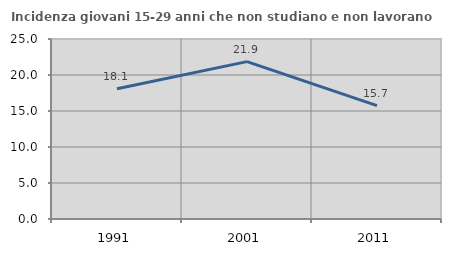
| Category | Incidenza giovani 15-29 anni che non studiano e non lavorano  |
|---|---|
| 1991.0 | 18.083 |
| 2001.0 | 21.861 |
| 2011.0 | 15.738 |